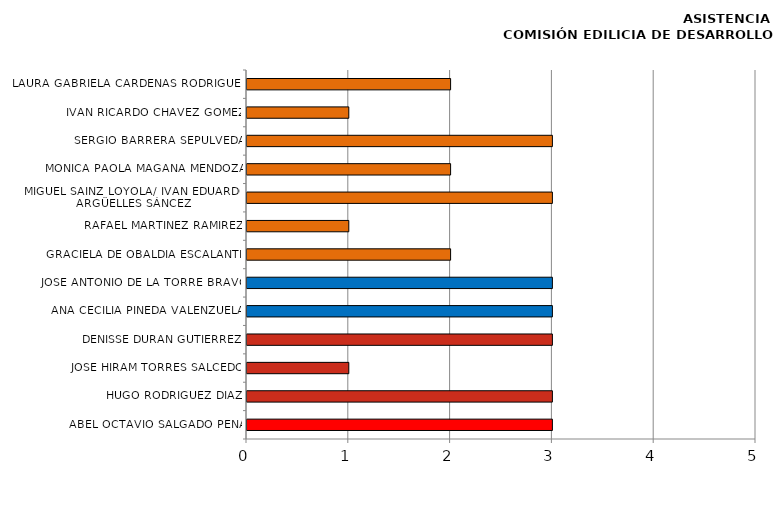
| Category | Series 0 |
|---|---|
| ABEL OCTAVIO SALGADO PEÑA | 3 |
| HUGO RODRÍGUEZ DÍAZ | 3 |
| JOSÉ HIRAM TORRES SALCEDO | 1 |
| DENISSE DURAN GUTIÉRREZ | 3 |
| ANA CECILIA PINEDA VALENZUELA | 3 |
| JOSÉ ANTONIO DE LA TORRE BRAVO | 3 |
| GRACIELA DE OBALDÍA ESCALANTE | 2 |
| RAFAEL MARTÍNEZ RAMÍREZ | 1 |
| MIGUEL SAINZ LOYOLA/ IVAN EDUARDO ARGÜELLES SÁNCEZ | 3 |
| MÓNICA PAOLA MAGAÑA MENDOZA | 2 |
| SERGIO BARRERA SEPÚLVEDA | 3 |
| IVÁN RICARDO CHÁVEZ GÓMEZ | 1 |
| LAURA GABRIELA CÁRDENAS RODRÍGUEZ | 2 |